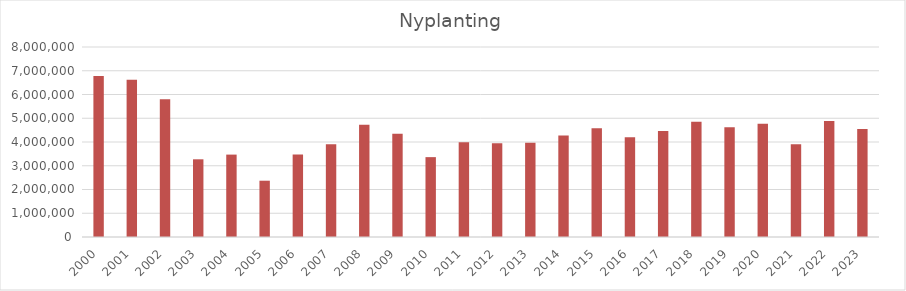
| Category | Nyplanting |
|---|---|
| 2000.0 | 6776969 |
| 2001.0 | 6622134 |
| 2002.0 | 5801712 |
| 2003.0 | 3271556 |
| 2004.0 | 3469386 |
| 2005.0 | 2370166 |
| 2006.0 | 3473699 |
| 2007.0 | 3902957 |
| 2008.0 | 4727511 |
| 2009.0 | 4345382 |
| 2010.0 | 3362757 |
| 2011.0 | 3984574 |
| 2012.0 | 3946714 |
| 2013.0 | 3968517 |
| 2014.0 | 4270889 |
| 2015.0 | 4574547 |
| 2016.0 | 4200212 |
| 2017.0 | 4468082 |
| 2018.0 | 4854955 |
| 2019.0 | 4623285 |
| 2020.0 | 4770709 |
| 2021.0 | 3901331 |
| 2022.0 | 4880230 |
| 2023.0 | 4552476 |